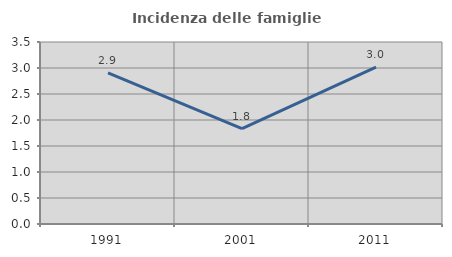
| Category | Incidenza delle famiglie numerose |
|---|---|
| 1991.0 | 2.907 |
| 2001.0 | 1.835 |
| 2011.0 | 3.019 |